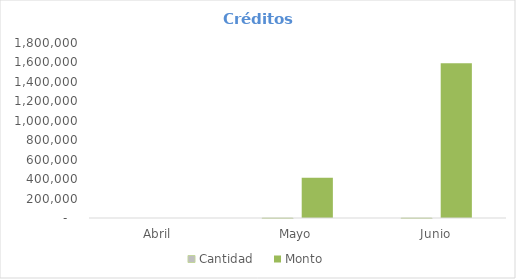
| Category | Cantidad 
 | Monto |
|---|---|---|
| Abril | 0 | 0 |
| Mayo | 40 | 414032.22 |
| Junio | 142 | 1591442.78 |